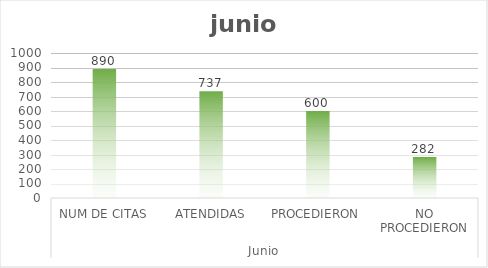
| Category | Series 0 |
|---|---|
| 0 | 890 |
| 1 | 737 |
| 2 | 600 |
| 3 | 282 |